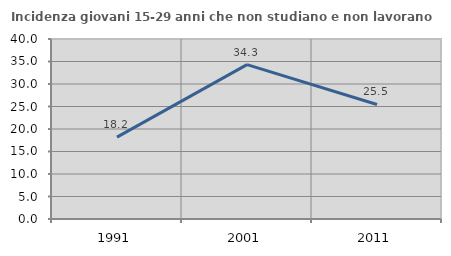
| Category | Incidenza giovani 15-29 anni che non studiano e non lavorano  |
|---|---|
| 1991.0 | 18.182 |
| 2001.0 | 34.302 |
| 2011.0 | 25.455 |